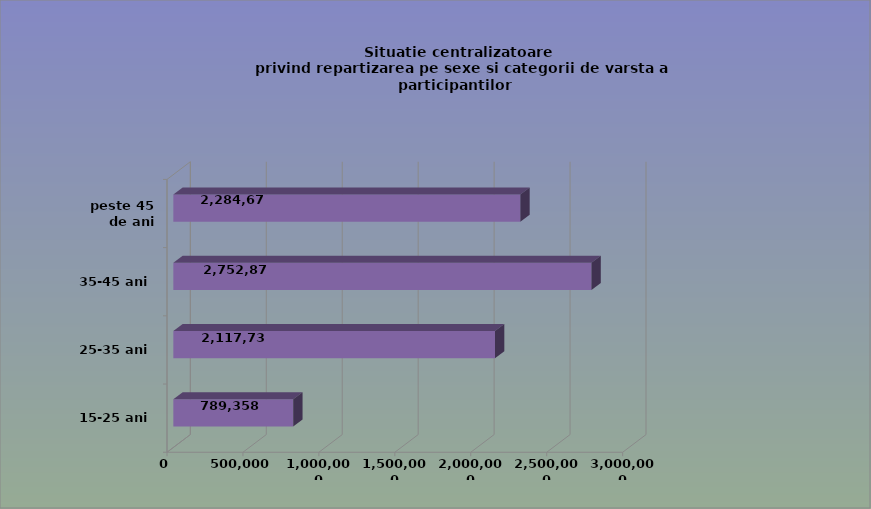
| Category | 15-25 ani 25-35 ani 35-45 ani peste 45 de ani |
|---|---|
| 15-25 ani | 789358 |
| 25-35 ani | 2117730 |
| 35-45 ani | 2752875 |
| peste 45 de ani | 2284671 |